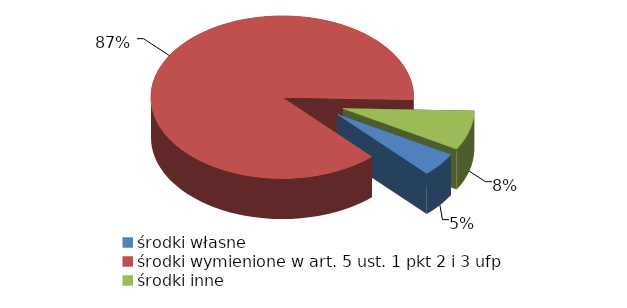
| Category | Series 0 |
|---|---|
| środki własne | 466637.85 |
| środki wymienione w art. 5 ust. 1 pkt 2 i 3 ufp | 8646173.87 |
| środki inne | 776863.43 |